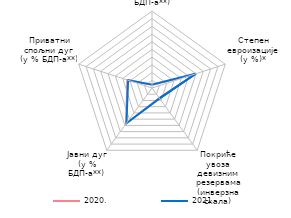
| Category | 2020. | 2021. |
|---|---|---|
| Текући дефицит платног биланса
(у % БДП-a**) | 4.1 | 4.4 |
| Степен
евроизације
(у %)* | 59.9 | 59.73 |
| Покриће увоза девизним резервама
(инверзна скала) | 16.3 | 16.7 |
| Јавни дуг
(у % БДП-a**) | 57 | 56.5 |
| Приватни
спољни дуг
(у % БДП-a**) | 33.8 | 32.6 |